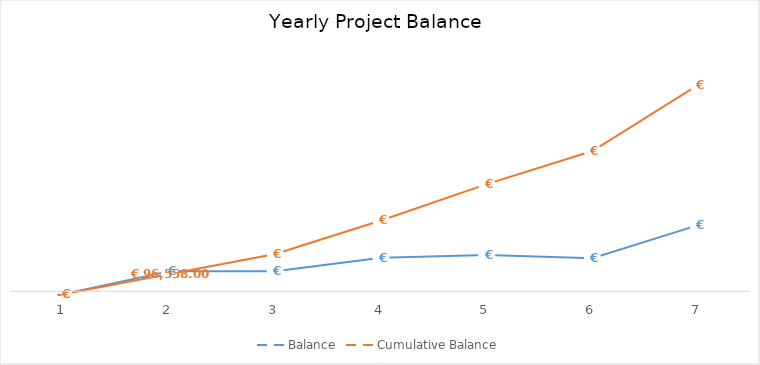
| Category | Balance | Cumulative Balance |
|---|---|---|
| 0 | -15930 | -15930 |
| 1 | 112488 | 96558 |
| 2 | 111511 | 208069 |
| 3 | 187797 | 395866 |
| 4 | 203367 | 599233 |
| 5 | 185254 | 784487 |
| 6 | 369921 | 1154408 |